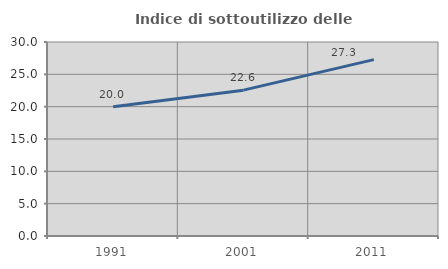
| Category | Indice di sottoutilizzo delle abitazioni  |
|---|---|
| 1991.0 | 20 |
| 2001.0 | 22.554 |
| 2011.0 | 27.273 |